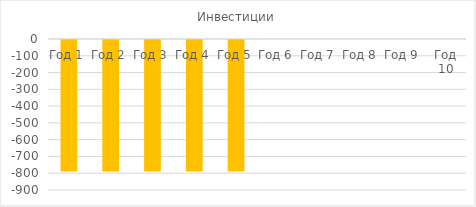
| Category | Инвестиции |
|---|---|
| Год 1 | -784 |
| Год 2 | -784 |
| Год 3 | -784 |
| Год 4 | -784 |
| Год 5 | -784 |
| Год 6 | 0 |
| Год 7 | 0 |
| Год 8 | 0 |
| Год 9 | 0 |
| Год 10 | 0 |